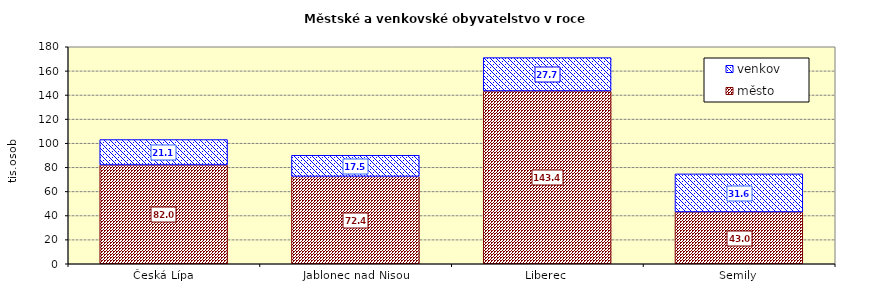
| Category | město | venkov |
|---|---|---|
| Česká Lípa | 81961 | 21076 |
| Jablonec nad Nisou | 72440 | 17547 |
| Liberec | 143352 | 27655 |
| Semily | 42973 | 31590 |